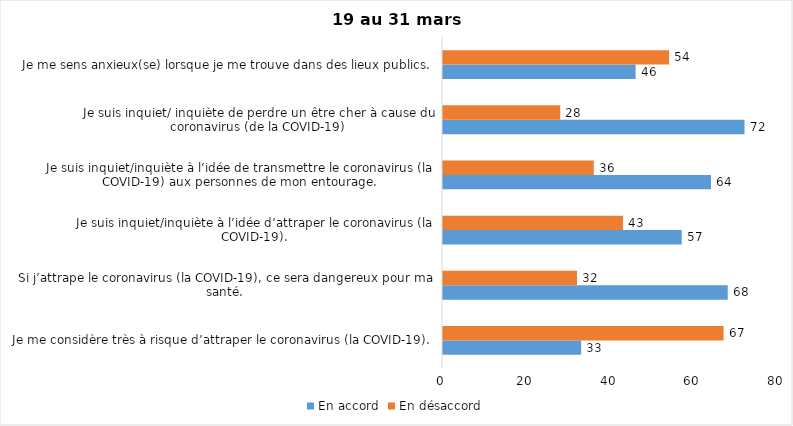
| Category | En accord | En désaccord |
|---|---|---|
| Je me considère très à risque d’attraper le coronavirus (la COVID-19). | 33 | 67 |
| Si j’attrape le coronavirus (la COVID-19), ce sera dangereux pour ma santé. | 68 | 32 |
| Je suis inquiet/inquiète à l’idée d’attraper le coronavirus (la COVID-19). | 57 | 43 |
| Je suis inquiet/inquiète à l’idée de transmettre le coronavirus (la COVID-19) aux personnes de mon entourage. | 64 | 36 |
| Je suis inquiet/ inquiète de perdre un être cher à cause du coronavirus (de la COVID-19) | 72 | 28 |
| Je me sens anxieux(se) lorsque je me trouve dans des lieux publics. | 46 | 54 |